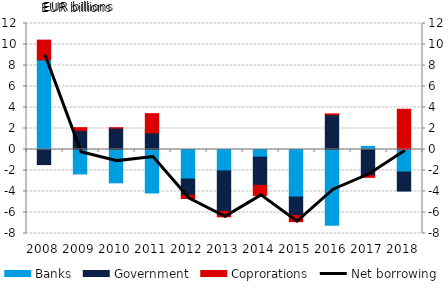
| Category | Banks | Government | Coprorations |
|---|---|---|---|
| 2008.0 | 8.54 | -1.437 | 1.876 |
| 2009.0 | -2.33 | 1.819 | 0.26 |
| 2010.0 | -3.173 | 2.035 | 0.033 |
| 2011.0 | -4.137 | 1.583 | 1.83 |
| 2012.0 | -2.812 | -1.551 | -0.303 |
| 2013.0 | -2.041 | -3.858 | -0.512 |
| 2014.0 | -0.731 | -2.683 | -0.959 |
| 2015.0 | -4.526 | -1.758 | -0.59 |
| 2016.0 | -7.221 | 3.323 | 0.071 |
| 2017.0 | 0.292 | -2.498 | -0.154 |
| 2018.0 | -2.145 | -1.814 | 3.829 |